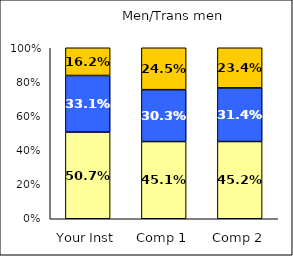
| Category | Low UG Ed Goal: Personal Development | Average UG Ed Goal: Personal Development | High UG Ed Goal: Personal Development |
|---|---|---|---|
| Your Inst | 0.507 | 0.331 | 0.162 |
| Comp 1 | 0.451 | 0.303 | 0.245 |
| Comp 2 | 0.452 | 0.314 | 0.234 |